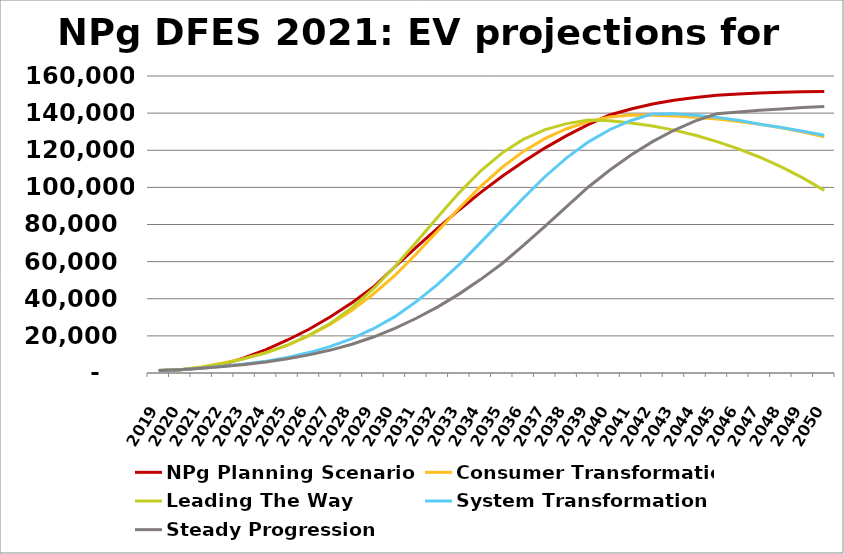
| Category | NPg Planning Scenario | Consumer Transformation | Leading The Way | System Transformation | Steady Progression |
|---|---|---|---|---|---|
| 2019.0 | 1314 | 1314 | 1314 | 1314 | 1314 |
| 2020.0 | 1813 | 1813 | 1813 | 1813 | 1813 |
| 2021.0 | 2768 | 3264 | 3163 | 2578 | 2568 |
| 2022.0 | 4633 | 5390 | 5118 | 3587 | 3529 |
| 2023.0 | 8236 | 7813 | 7754 | 4850 | 4614 |
| 2024.0 | 12606 | 10998 | 10916 | 6398 | 5960 |
| 2025.0 | 17788 | 15050 | 14993 | 8407 | 7656 |
| 2026.0 | 23574 | 20151 | 20249 | 11007 | 9761 |
| 2027.0 | 30284 | 26345 | 26798 | 14331 | 12351 |
| 2028.0 | 37901 | 33775 | 35184 | 18552 | 15521 |
| 2029.0 | 46294 | 42562 | 45406 | 23846 | 19373 |
| 2030.0 | 57246 | 52548 | 57356 | 30358 | 23988 |
| 2031.0 | 67838 | 64226 | 70552 | 38494 | 29495 |
| 2032.0 | 78114 | 76576 | 84068 | 47827 | 35634 |
| 2033.0 | 87960 | 88903 | 97177 | 58535 | 42633 |
| 2034.0 | 97288 | 100548 | 108964 | 70372 | 50459 |
| 2035.0 | 105965 | 110839 | 118598 | 82362 | 59003 |
| 2036.0 | 113954 | 119515 | 125976 | 94430 | 68834 |
| 2037.0 | 121289 | 126407 | 131126 | 105871 | 79172 |
| 2038.0 | 127903 | 131592 | 134346 | 115924 | 89684 |
| 2039.0 | 133809 | 135410 | 136272 | 124386 | 100094 |
| 2040.0 | 138995 | 137973 | 135870 | 131059 | 109196 |
| 2041.0 | 142256 | 138933 | 134721 | 136032 | 117405 |
| 2042.0 | 144879 | 138856 | 133024 | 139577 | 124627 |
| 2043.0 | 146918 | 138452 | 130844 | 139612 | 130751 |
| 2044.0 | 148462 | 137756 | 128042 | 138840 | 135831 |
| 2045.0 | 149580 | 136781 | 124678 | 137713 | 139620 |
| 2046.0 | 150357 | 135534 | 120757 | 136150 | 140625 |
| 2047.0 | 150899 | 133971 | 116228 | 134062 | 141503 |
| 2048.0 | 151247 | 132140 | 111034 | 132283 | 142281 |
| 2049.0 | 151472 | 129858 | 105115 | 130283 | 142981 |
| 2050.0 | 151609 | 127201 | 98402 | 128134 | 143624 |